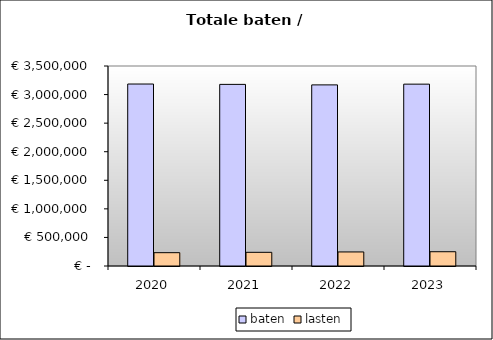
| Category | baten | lasten |
|---|---|---|
| 2020.0 | 3184526.453 | 233099.2 |
| 2021.0 | 3178366.371 | 239529.6 |
| 2022.0 | 3169430.807 | 246070.4 |
| 2023.0 | 3182512.577 | 249912 |